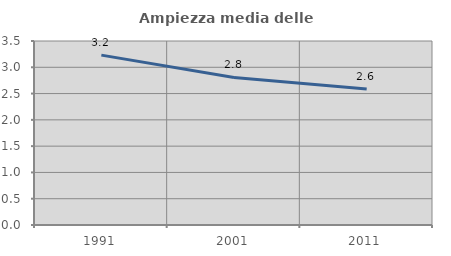
| Category | Ampiezza media delle famiglie |
|---|---|
| 1991.0 | 3.232 |
| 2001.0 | 2.806 |
| 2011.0 | 2.585 |